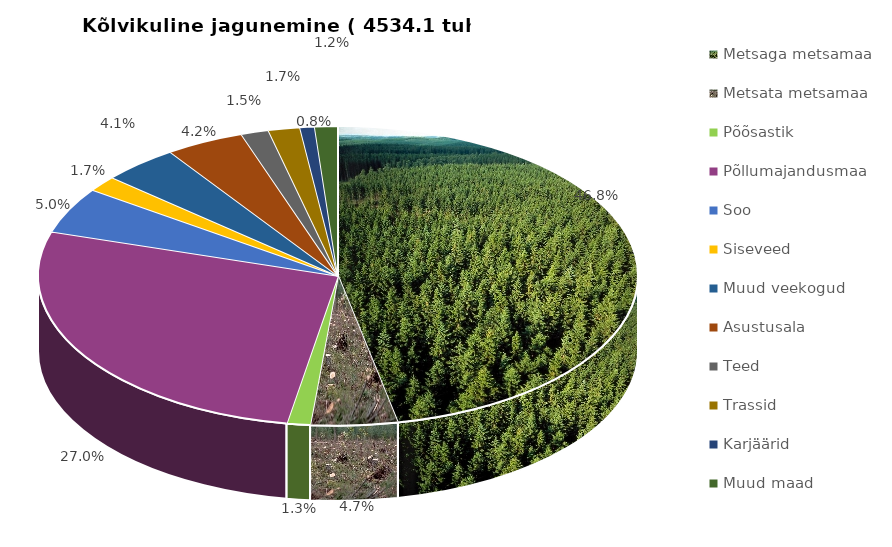
| Category | M a a k a t e g o o r i a |
|---|---|
| Metsaga metsamaa | 2122.094 |
| Metsata metsamaa | 212.084 |
| Põõsastik | 57.006 |
| Põllumajandusmaa | 1225.865 |
| Soo | 225.097 |
| Siseveed | 75.908 |
| Muud veekogud | 187.108 |
| Asustusala | 191.933 |
| Teed | 67.844 |
| Trassid | 77.536 |
| Karjäärid | 35.658 |
| Muud maad | 55.956 |